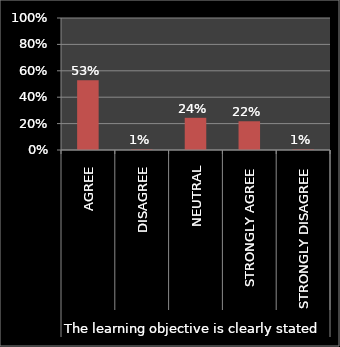
| Category | Series 0 |
|---|---|
| 0 | 0.528 |
| 1 | 0.005 |
| 2 | 0.244 |
| 3 | 0.218 |
| 4 | 0.005 |